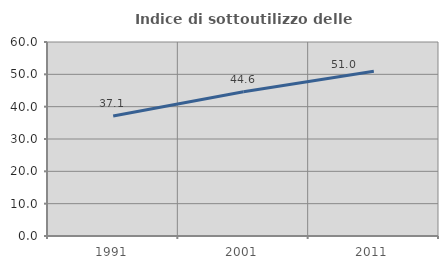
| Category | Indice di sottoutilizzo delle abitazioni  |
|---|---|
| 1991.0 | 37.086 |
| 2001.0 | 44.604 |
| 2011.0 | 50.962 |